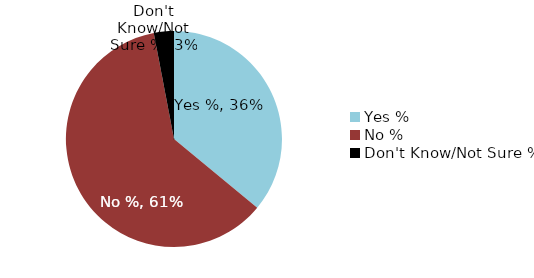
| Category | Yes % |
|---|---|
| Yes % | 0.36 |
| No % | 0.61 |
| Don't Know/Not Sure % | 0.03 |